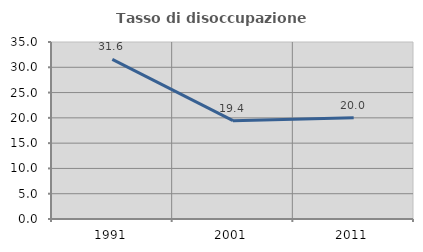
| Category | Tasso di disoccupazione giovanile  |
|---|---|
| 1991.0 | 31.579 |
| 2001.0 | 19.444 |
| 2011.0 | 20 |